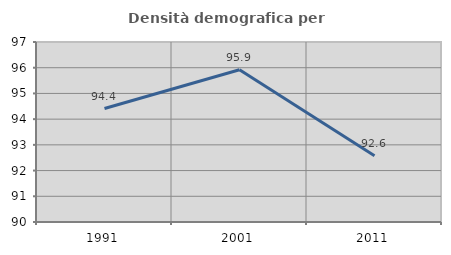
| Category | Densità demografica |
|---|---|
| 1991.0 | 94.412 |
| 2001.0 | 95.922 |
| 2011.0 | 92.579 |